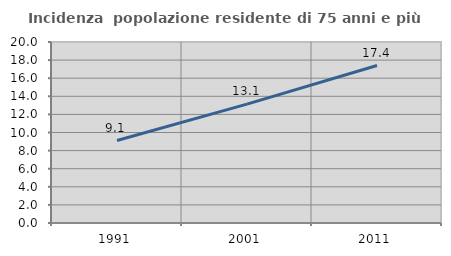
| Category | Incidenza  popolazione residente di 75 anni e più |
|---|---|
| 1991.0 | 9.111 |
| 2001.0 | 13.14 |
| 2011.0 | 17.401 |